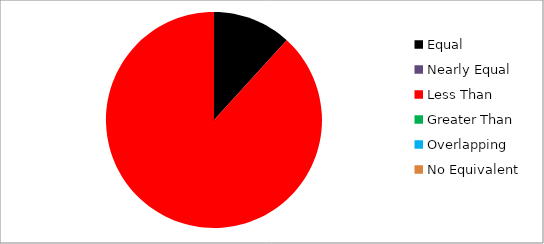
| Category | Series 0 |
|---|---|
| Equal | 2 |
| Nearly Equal | 0 |
| Less Than | 15 |
| Greater Than | 0 |
| Overlapping | 0 |
| No Equivalent | 0 |